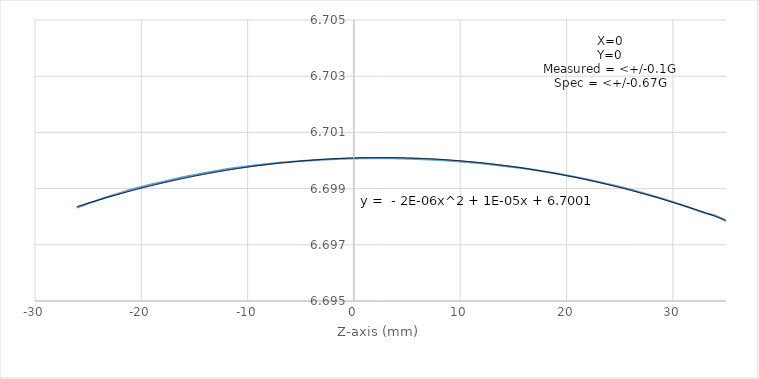
| Category | Series 0 |
|---|---|
| -26.0 | 6.698 |
| -26.0 | 6.698 |
| -26.0 | 6.698 |
| -26.0 | 6.698 |
| -26.0 | 6.698 |
| -26.0 | 6.698 |
| -25.9 | 6.698 |
| -25.9 | 6.698 |
| -25.9 | 6.698 |
| -25.9 | 6.698 |
| -25.8 | 6.698 |
| -25.7 | 6.698 |
| -25.6 | 6.698 |
| -25.5 | 6.698 |
| -25.4 | 6.698 |
| -25.3 | 6.698 |
| -25.2 | 6.698 |
| -25.1 | 6.698 |
| -25.0 | 6.698 |
| -24.9 | 6.698 |
| -24.8 | 6.699 |
| -24.7 | 6.699 |
| -24.6 | 6.699 |
| -24.5 | 6.699 |
| -24.4 | 6.699 |
| -24.0 | 6.699 |
| -24.0 | 6.699 |
| -23.0 | 6.699 |
| -22.0 | 6.699 |
| -21.0 | 6.699 |
| -20.0 | 6.699 |
| -19.0 | 6.699 |
| -18.0 | 6.699 |
| -17.0 | 6.699 |
| -16.0 | 6.699 |
| -15.0 | 6.699 |
| -14.0 | 6.7 |
| -13.0 | 6.7 |
| -12.0 | 6.7 |
| -11.0 | 6.7 |
| -10.0 | 6.7 |
| -9.0 | 6.7 |
| -8.0 | 6.7 |
| -7.0 | 6.7 |
| -6.0 | 6.7 |
| -5.0 | 6.7 |
| -4.0 | 6.7 |
| -3.0 | 6.7 |
| -2.0 | 6.7 |
| -1.0 | 6.7 |
| 0.0 | 6.7 |
| 1.0 | 6.7 |
| 2.0 | 6.7 |
| 3.0 | 6.7 |
| 4.0 | 6.7 |
| 5.0 | 6.7 |
| 6.0 | 6.7 |
| 7.0 | 6.7 |
| 8.0 | 6.7 |
| 9.0 | 6.7 |
| 10.0 | 6.7 |
| 11.0 | 6.7 |
| 12.0 | 6.7 |
| 13.0 | 6.7 |
| 14.0 | 6.7 |
| 15.0 | 6.7 |
| 16.0 | 6.7 |
| 17.0 | 6.7 |
| 18.0 | 6.7 |
| 19.0 | 6.7 |
| 20.0 | 6.699 |
| 21.0 | 6.699 |
| 22.0 | 6.699 |
| 23.0 | 6.699 |
| 24.0 | 6.699 |
| 25.0 | 6.699 |
| 26.0 | 6.699 |
| 27.0 | 6.699 |
| 28.0 | 6.699 |
| 29.0 | 6.699 |
| 30.0 | 6.699 |
| 31.0 | 6.698 |
| 32.0 | 6.698 |
| 33.0 | 6.698 |
| 34.0 | 6.698 |
| 35.0 | 6.698 |